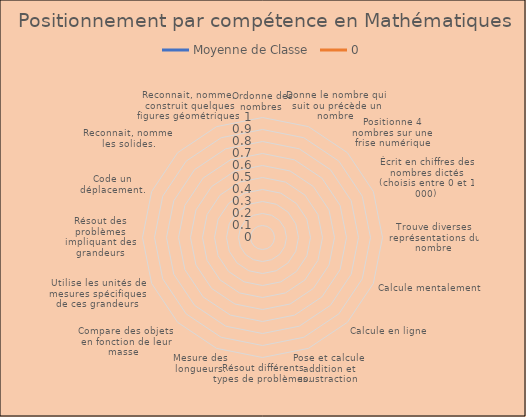
| Category | Moyenne de Classe | 0 |
|---|---|---|
| Ordonne des nombres  | 0 |  |
| Donne le nombre qui suit ou précède un nombre | 0 |  |
| Positionne 4 nombres sur une frise numérique | 0 |  |
| Écrit en chiffres des nombres dictés (choisis entre 0 et 1 000) | 0 |  |
| Trouve diverses représentations du nombre | 0 |  |
| Calcule mentalement  | 0 |  |
| Calcule en ligne | 0 |  |
| Pose et calcule addition et soustraction  | 0 |  |
| Résout différents types de problèmes.  | 0 |  |
| Mesure des longueurs. | 0 |  |
| Compare des objets en fonction de leur masse  | 0 |  |
| Utilise les unités de mesures spécifiques de ces grandeurs | 0 |  |
| Résout des problèmes impliquant des grandeurs | 0 |  |
| Code un déplacement. | 0 |  |
| Reconnait, nomme les solides. | 0 |  |
| Reconnait, nomme, construit quelques figures géométriques  | 0 |  |